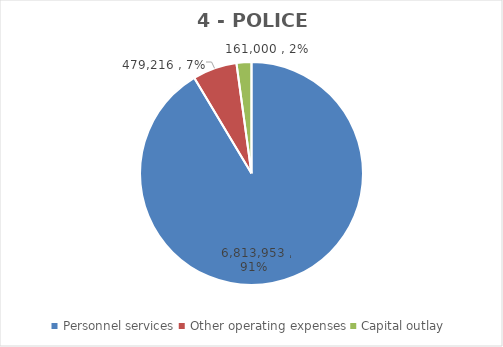
| Category | Series 0 | Series 1 | Series 2 | Series 3 | Series 4 | Series 5 | Series 6 |
|---|---|---|---|---|---|---|---|
| Personnel services | 6813953 |  |  | 6298055 | 6669865 | 6813953 | 6813953 |
| Other operating expenses | 479216 |  |  | 401430 | 459280 | 479216 | 479216 |
| Capital outlay | 161000 |  |  | 178211 | 132500 | 211000 | 161000 |